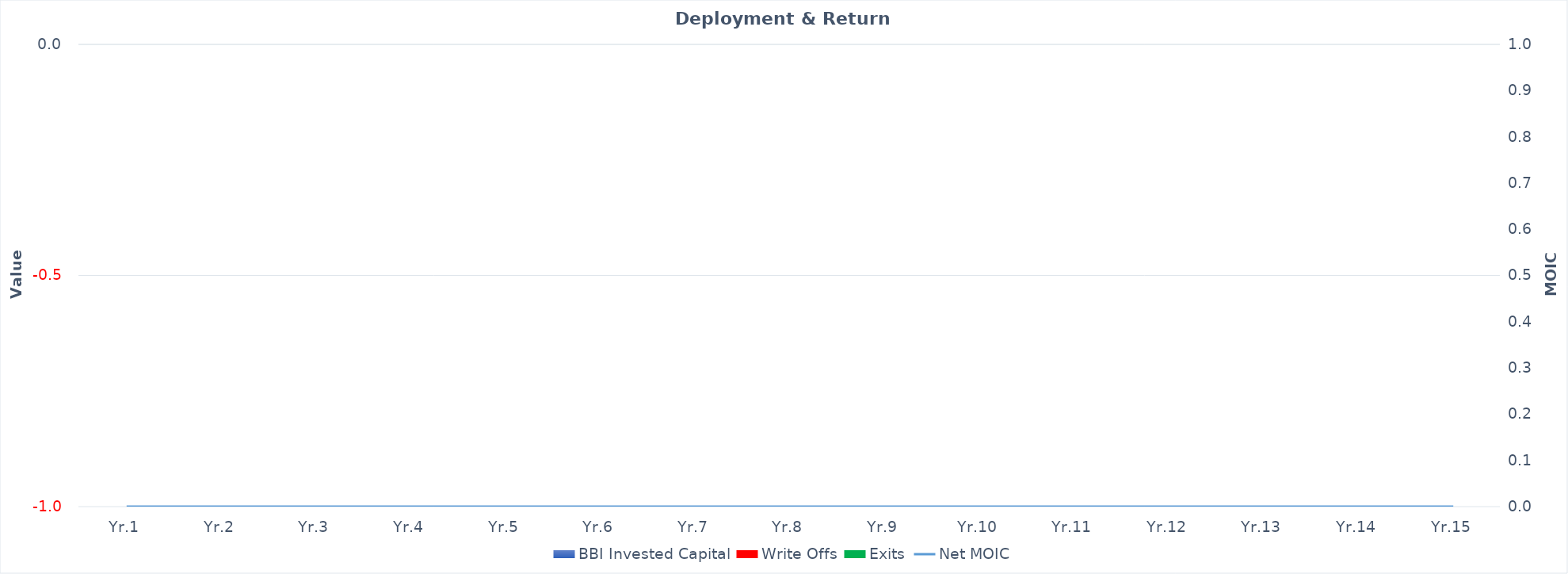
| Category | BBI Invested Capital | Write Offs | Exits |
|---|---|---|---|
| Yr.1 | 0 | 0 | 0 |
| Yr.2 | 0 | 0 | 0 |
| Yr.3 | 0 | 0 | 0 |
| Yr.4 | 0 | 0 | 0 |
| Yr.5 | 0 | 0 | 0 |
| Yr.6 | 0 | 0 | 0 |
| Yr.7 | 0 | 0 | 0 |
| Yr.8 | 0 | 0 | 0 |
| Yr.9 | 0 | 0 | 0 |
| Yr.10 | 0 | 0 | 0 |
| Yr.11 | 0 | 0 | 0 |
| Yr.12 | 0 | 0 | 0 |
| Yr.13 | 0 | 0 | 0 |
| Yr.14 | 0 | 0 | 0 |
| Yr.15 | 0 | 0 | 0 |